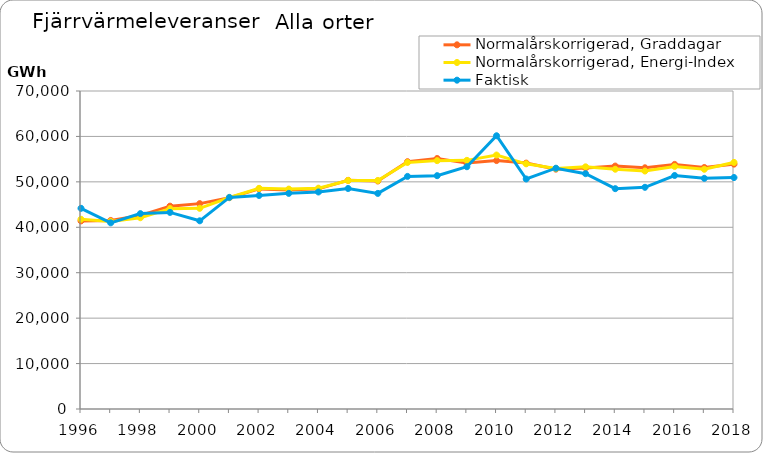
| Category | Normalårskorrigerad, Graddagar | Normalårskorrigerad, Energi-Index | Faktisk |
|---|---|---|---|
| 1996.0 | 41407.349 | 41759.437 | 44174 |
| 1997.0 | 41504.928 | 41285.222 | 40975 |
| 1998.0 | 42620.28 | 42103.872 | 43012 |
| 1999.0 | 44652.053 | 44105.857 | 43278 |
| 2000.0 | 45208.343 | 44177.746 | 41425 |
| 2001.0 | 46511.429 | 46557.192 | 46580 |
| 2002.0 | 48448.551 | 48569.353 | 47008 |
| 2003.0 | 48235.047 | 48404.147 | 47468.061 |
| 2004.0 | 48454.717 | 48607.796 | 47768 |
| 2005.0 | 50331.426 | 50312.611 | 48543 |
| 2006.0 | 50185.881 | 50294.09 | 47460.083 |
| 2007.0 | 54440.989 | 54267.368 | 51201.503 |
| 2008.0 | 55137.102 | 54673.566 | 51359.541 |
| 2009.0 | 54126.087 | 54730.223 | 53332.048 |
| 2010.0 | 54685.283 | 55903.329 | 60151 |
| 2011.0 | 54129.516 | 53970.358 | 50631.317 |
| 2012.0 | 52796.003 | 52921.901 | 53003.347 |
| 2013.0 | 53068.526 | 53306.899 | 51800 |
| 2014.0 | 53475.001 | 52781.982 | 48500 |
| 2015.0 | 53095.226 | 52385.856 | 48800 |
| 2016.0 | 53845.243 | 53397.623 | 51400 |
| 2017.0 | 53162.054 | 52768.143 | 50775 |
| 2018.0 | 53900.72 | 54276.991 | 50951 |